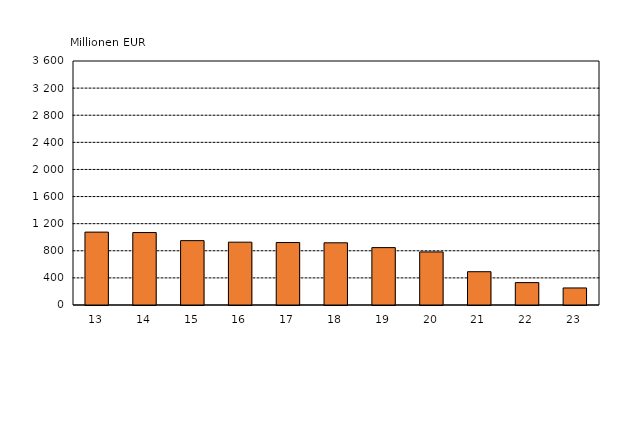
| Category | Series 0 |
|---|---|
| 13 | 1075.358 |
| 14 | 1069.08 |
| 15 | 949.673 |
| 16 | 926.825 |
| 17 | 921.835 |
| 18 | 917.628 |
| 19 | 846.647 |
| 20 | 782.736 |
| 21 | 491.189 |
| 22 | 330.512 |
| 23 | 251.374 |